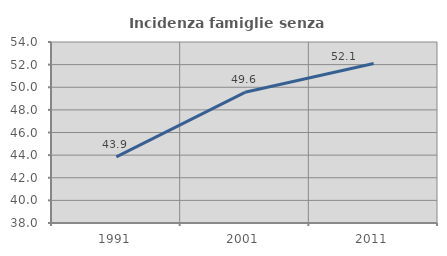
| Category | Incidenza famiglie senza nuclei |
|---|---|
| 1991.0 | 43.852 |
| 2001.0 | 49.554 |
| 2011.0 | 52.093 |